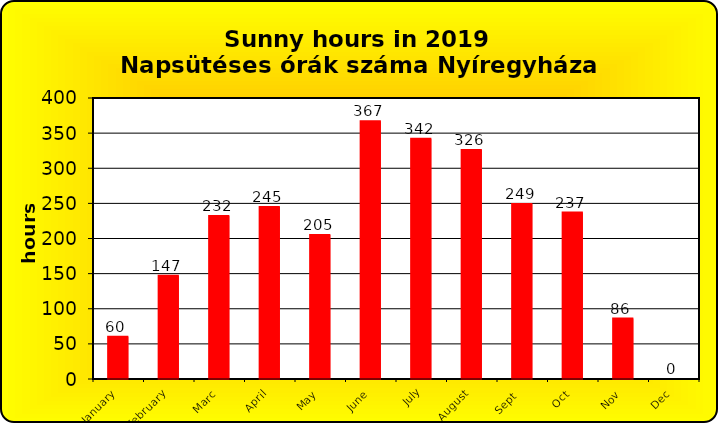
| Category | Series 0 |
|---|---|
| January | 60 |
| February | 147 |
| Marc | 232 |
| April | 245 |
| May | 205 |
| June | 367 |
| July | 342 |
| August | 326 |
| Sept  | 249 |
| Oct | 237 |
| Nov | 86 |
| Dec | 0 |